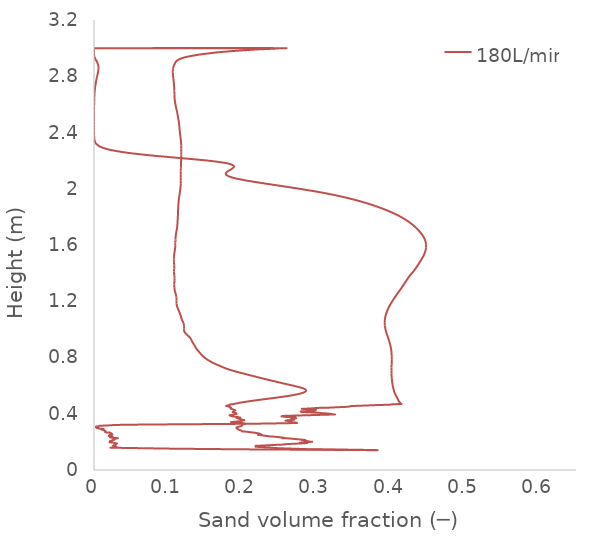
| Category | 180L/min |
|---|---|
| 0.369943 | 0.14 |
| 0.360485 | 0.144 |
| 0.335591 | 0.145 |
| 0.315067 | 0.146 |
| 0.293034 | 0.148 |
| 0.288265 | 0.148 |
| 0.275559 | 0.15 |
| 0.247444 | 0.155 |
| 0.235409 | 0.16 |
| 0.229629 | 0.161 |
| 0.226897 | 0.163 |
| 0.218637 | 0.165 |
| 0.218549 | 0.165 |
| 0.219073 | 0.171 |
| 0.218907 | 0.172 |
| 0.235123 | 0.176 |
| 0.248358 | 0.179 |
| 0.255184 | 0.181 |
| 0.255772 | 0.181 |
| 0.25628 | 0.181 |
| 0.25686 | 0.182 |
| 0.257129 | 0.182 |
| 0.256682 | 0.183 |
| 0.262632 | 0.185 |
| 0.287318 | 0.192 |
| 0.277536 | 0.194 |
| 0.293397 | 0.2 |
| 0.292918 | 0.201 |
| 0.291872 | 0.201 |
| 0.292191 | 0.201 |
| 0.291515 | 0.202 |
| 0.290686 | 0.202 |
| 0.281005 | 0.213 |
| 0.280462 | 0.213 |
| 0.28184 | 0.214 |
| 0.283546 | 0.214 |
| 0.283195 | 0.215 |
| 0.263237 | 0.224 |
| 0.262009 | 0.225 |
| 0.259293 | 0.225 |
| 0.25496 | 0.226 |
| 0.253109 | 0.227 |
| 0.254855 | 0.229 |
| 0.25538 | 0.23 |
| 0.243188 | 0.237 |
| 0.237106 | 0.239 |
| 0.233045 | 0.242 |
| 0.222062 | 0.249 |
| 0.222417 | 0.25 |
| 0.223795 | 0.25 |
| 0.225544 | 0.251 |
| 0.225555 | 0.251 |
| 0.226014 | 0.252 |
| 0.22598 | 0.252 |
| 0.225965 | 0.252 |
| 0.223069 | 0.259 |
| 0.222853 | 0.259 |
| 0.217275 | 0.265 |
| 0.216869 | 0.265 |
| 0.215009 | 0.266 |
| 0.214463 | 0.266 |
| 0.2044 | 0.273 |
| 0.199862 | 0.274 |
| 0.199863 | 0.274 |
| 0.199868 | 0.275 |
| 0.199716 | 0.275 |
| 0.199702 | 0.275 |
| 0.198971 | 0.279 |
| 0.196893 | 0.284 |
| 0.196449 | 0.285 |
| 0.195909 | 0.286 |
| 0.195221 | 0.286 |
| 0.193393 | 0.293 |
| 0.192344 | 0.296 |
| 0.192377 | 0.296 |
| 0.19254 | 0.296 |
| 0.193217 | 0.297 |
| 0.1929 | 0.298 |
| 0.192809 | 0.298 |
| 0.192113 | 0.302 |
| 0.195066 | 0.307 |
| 0.195598 | 0.308 |
| 0.195605 | 0.308 |
| 0.195454 | 0.308 |
| 0.195959 | 0.309 |
| 0.197189 | 0.311 |
| 0.197449 | 0.311 |
| 0.199062 | 0.312 |
| 0.19936 | 0.321 |
| 0.200365 | 0.322 |
| 0.199881 | 0.323 |
| 0.204016 | 0.329 |
| 0.203544 | 0.33 |
| 0.201994 | 0.331 |
| 0.200722 | 0.332 |
| 0.200748 | 0.333 |
| 0.20029 | 0.333 |
| 0.200152 | 0.333 |
| 0.185555 | 0.341 |
| 0.186625 | 0.342 |
| 0.189461 | 0.343 |
| 0.192214 | 0.345 |
| 0.19846 | 0.348 |
| 0.198485 | 0.348 |
| 0.1986 | 0.348 |
| 0.19858 | 0.348 |
| 0.198893 | 0.35 |
| 0.199864 | 0.351 |
| 0.202407 | 0.355 |
| 0.202526 | 0.355 |
| 0.198691 | 0.359 |
| 0.198931 | 0.36 |
| 0.198905 | 0.36 |
| 0.198395 | 0.361 |
| 0.19726 | 0.362 |
| 0.196656 | 0.363 |
| 0.192236 | 0.37 |
| 0.194893 | 0.371 |
| 0.197347 | 0.372 |
| 0.195531 | 0.374 |
| 0.191929 | 0.379 |
| 0.190294 | 0.38 |
| 0.186749 | 0.381 |
| 0.183183 | 0.388 |
| 0.183202 | 0.388 |
| 0.18341 | 0.389 |
| 0.182917 | 0.389 |
| 0.182885 | 0.39 |
| 0.18535 | 0.392 |
| 0.187263 | 0.394 |
| 0.190474 | 0.398 |
| 0.192926 | 0.401 |
| 0.19293 | 0.401 |
| 0.192932 | 0.401 |
| 0.189045 | 0.411 |
| 0.18756 | 0.412 |
| 0.187007 | 0.412 |
| 0.187464 | 0.413 |
| 0.187498 | 0.413 |
| 0.187376 | 0.413 |
| 0.188635 | 0.418 |
| 0.190007 | 0.423 |
| 0.190106 | 0.424 |
| 0.190341 | 0.424 |
| 0.190269 | 0.425 |
| 0.186362 | 0.433 |
| 0.184234 | 0.436 |
| 0.184411 | 0.437 |
| 0.184325 | 0.437 |
| 0.184878 | 0.442 |
| 0.183186 | 0.447 |
| 0.183152 | 0.447 |
| 0.183188 | 0.447 |
| 0.182915 | 0.448 |
| 0.18348 | 0.448 |
| 0.183518 | 0.448 |
| 0.183749 | 0.449 |
| 0.182955 | 0.45 |
| 0.178385 | 0.456 |
| 0.178975 | 0.457 |
| 0.17953 | 0.457 |
| 0.181478 | 0.46 |
| 0.183208 | 0.465 |
| 0.183247 | 0.465 |
| 0.188839 | 0.47 |
| 0.188895 | 0.47 |
| 0.188951 | 0.47 |
| 0.188983 | 0.47 |
| 0.199024 | 0.48 |
| 0.211677 | 0.491 |
| 0.226224 | 0.501 |
| 0.241479 | 0.511 |
| 0.255796 | 0.522 |
| 0.268079 | 0.532 |
| 0.27758 | 0.542 |
| 0.283484 | 0.553 |
| 0.285914 | 0.563 |
| 0.284951 | 0.574 |
| 0.280343 | 0.584 |
| 0.273049 | 0.594 |
| 0.264541 | 0.605 |
| 0.255999 | 0.615 |
| 0.247718 | 0.625 |
| 0.239459 | 0.636 |
| 0.231282 | 0.646 |
| 0.22345 | 0.656 |
| 0.215807 | 0.667 |
| 0.2082 | 0.677 |
| 0.200588 | 0.687 |
| 0.192975 | 0.698 |
| 0.185891 | 0.708 |
| 0.179804 | 0.718 |
| 0.17472 | 0.729 |
| 0.170161 | 0.739 |
| 0.165654 | 0.75 |
| 0.161338 | 0.76 |
| 0.157525 | 0.77 |
| 0.154178 | 0.781 |
| 0.151196 | 0.791 |
| 0.148585 | 0.801 |
| 0.146342 | 0.812 |
| 0.144484 | 0.822 |
| 0.142833 | 0.832 |
| 0.141183 | 0.843 |
| 0.139561 | 0.853 |
| 0.138013 | 0.863 |
| 0.136799 | 0.874 |
| 0.135725 | 0.884 |
| 0.134515 | 0.894 |
| 0.133296 | 0.905 |
| 0.132164 | 0.915 |
| 0.131304 | 0.926 |
| 0.130217 | 0.936 |
| 0.128489 | 0.946 |
| 0.126501 | 0.957 |
| 0.124489 | 0.967 |
| 0.122699 | 0.977 |
| 0.121632 | 0.988 |
| 0.121325 | 0.998 |
| 0.121343 | 1.008 |
| 0.121428 | 1.019 |
| 0.121423 | 1.029 |
| 0.121049 | 1.039 |
| 0.120216 | 1.05 |
| 0.119224 | 1.06 |
| 0.118415 | 1.07 |
| 0.11784 | 1.081 |
| 0.117285 | 1.091 |
| 0.116604 | 1.102 |
| 0.115903 | 1.112 |
| 0.115187 | 1.122 |
| 0.114387 | 1.133 |
| 0.113549 | 1.143 |
| 0.112738 | 1.153 |
| 0.112032 | 1.164 |
| 0.11154 | 1.174 |
| 0.111298 | 1.184 |
| 0.111234 | 1.195 |
| 0.111255 | 1.205 |
| 0.111286 | 1.215 |
| 0.111204 | 1.226 |
| 0.110913 | 1.236 |
| 0.110428 | 1.246 |
| 0.109852 | 1.257 |
| 0.109309 | 1.267 |
| 0.10888 | 1.278 |
| 0.108585 | 1.288 |
| 0.108397 | 1.298 |
| 0.108313 | 1.309 |
| 0.10832 | 1.319 |
| 0.108375 | 1.329 |
| 0.108449 | 1.34 |
| 0.108515 | 1.35 |
| 0.108549 | 1.36 |
| 0.108525 | 1.371 |
| 0.108409 | 1.381 |
| 0.108201 | 1.391 |
| 0.107992 | 1.402 |
| 0.107897 | 1.412 |
| 0.107958 | 1.422 |
| 0.108106 | 1.433 |
| 0.108206 | 1.443 |
| 0.108185 | 1.454 |
| 0.108063 | 1.464 |
| 0.107896 | 1.474 |
| 0.107753 | 1.485 |
| 0.107695 | 1.495 |
| 0.107735 | 1.505 |
| 0.107853 | 1.516 |
| 0.10802 | 1.526 |
| 0.108237 | 1.536 |
| 0.108513 | 1.547 |
| 0.108836 | 1.557 |
| 0.109163 | 1.567 |
| 0.109403 | 1.578 |
| 0.109534 | 1.588 |
| 0.109616 | 1.598 |
| 0.10967 | 1.609 |
| 0.109713 | 1.619 |
| 0.109772 | 1.63 |
| 0.109866 | 1.64 |
| 0.110001 | 1.65 |
| 0.110178 | 1.661 |
| 0.110399 | 1.671 |
| 0.110663 | 1.681 |
| 0.110986 | 1.692 |
| 0.111338 | 1.702 |
| 0.111721 | 1.713 |
| 0.112071 | 1.724 |
| 0.112311 | 1.736 |
| 0.112454 | 1.748 |
| 0.112623 | 1.759 |
| 0.112709 | 1.769 |
| 0.112818 | 1.779 |
| 0.11293 | 1.79 |
| 0.11304 | 1.8 |
| 0.113142 | 1.81 |
| 0.11322 | 1.821 |
| 0.113283 | 1.831 |
| 0.113349 | 1.842 |
| 0.113422 | 1.852 |
| 0.113507 | 1.862 |
| 0.113608 | 1.873 |
| 0.113726 | 1.883 |
| 0.113861 | 1.893 |
| 0.114021 | 1.904 |
| 0.114212 | 1.914 |
| 0.114432 | 1.924 |
| 0.11468 | 1.935 |
| 0.114957 | 1.945 |
| 0.115253 | 1.955 |
| 0.115556 | 1.966 |
| 0.115856 | 1.976 |
| 0.116141 | 1.986 |
| 0.116399 | 1.997 |
| 0.11662 | 2.007 |
| 0.116794 | 2.018 |
| 0.116923 | 2.028 |
| 0.117014 | 2.038 |
| 0.11707 | 2.049 |
| 0.117097 | 2.059 |
| 0.117109 | 2.069 |
| 0.11711 | 2.08 |
| 0.117105 | 2.09 |
| 0.117098 | 2.1 |
| 0.117098 | 2.111 |
| 0.117106 | 2.121 |
| 0.117123 | 2.131 |
| 0.117152 | 2.142 |
| 0.117194 | 2.152 |
| 0.117252 | 2.162 |
| 0.117321 | 2.173 |
| 0.117396 | 2.183 |
| 0.117475 | 2.194 |
| 0.117557 | 2.204 |
| 0.11764 | 2.214 |
| 0.117717 | 2.225 |
| 0.117779 | 2.235 |
| 0.117807 | 2.245 |
| 0.117806 | 2.256 |
| 0.117784 | 2.266 |
| 0.117755 | 2.276 |
| 0.117725 | 2.287 |
| 0.117686 | 2.297 |
| 0.117626 | 2.307 |
| 0.117539 | 2.318 |
| 0.117415 | 2.328 |
| 0.117245 | 2.338 |
| 0.117037 | 2.349 |
| 0.116806 | 2.359 |
| 0.116561 | 2.37 |
| 0.116312 | 2.38 |
| 0.11607 | 2.39 |
| 0.115847 | 2.401 |
| 0.115652 | 2.411 |
| 0.115479 | 2.421 |
| 0.115313 | 2.432 |
| 0.115139 | 2.442 |
| 0.114932 | 2.452 |
| 0.114687 | 2.463 |
| 0.114419 | 2.473 |
| 0.114139 | 2.483 |
| 0.113839 | 2.494 |
| 0.113513 | 2.504 |
| 0.113174 | 2.514 |
| 0.112825 | 2.525 |
| 0.112456 | 2.535 |
| 0.112053 | 2.546 |
| 0.11162 | 2.556 |
| 0.111175 | 2.566 |
| 0.11074 | 2.577 |
| 0.110325 | 2.587 |
| 0.109935 | 2.597 |
| 0.109575 | 2.608 |
| 0.109256 | 2.618 |
| 0.108986 | 2.628 |
| 0.108773 | 2.639 |
| 0.108618 | 2.649 |
| 0.108515 | 2.659 |
| 0.108454 | 2.67 |
| 0.108413 | 2.68 |
| 0.108372 | 2.69 |
| 0.108317 | 2.701 |
| 0.108242 | 2.711 |
| 0.108139 | 2.722 |
| 0.108003 | 2.732 |
| 0.10784 | 2.742 |
| 0.107658 | 2.753 |
| 0.107463 | 2.763 |
| 0.107256 | 2.773 |
| 0.107046 | 2.784 |
| 0.106841 | 2.794 |
| 0.106647 | 2.804 |
| 0.106481 | 2.815 |
| 0.106364 | 2.825 |
| 0.106328 | 2.835 |
| 0.106423 | 2.846 |
| 0.106694 | 2.856 |
| 0.107141 | 2.866 |
| 0.107802 | 2.877 |
| 0.108707 | 2.887 |
| 0.10976 | 2.898 |
| 0.111243 | 2.908 |
| 0.113959 | 2.918 |
| 0.118597 | 2.929 |
| 0.125937 | 2.939 |
| 0.13655 | 2.949 |
| 0.149888 | 2.96 |
| 0.166549 | 2.97 |
| 0.166549 | 2.97 |
| 0.189147 | 2.98 |
| 0.217783 | 2.99 |
| 0.241577 | 3 |
| 0.0790493 | 3 |
| 0.0788648 | 3 |
| 0.0769035 | 3 |
| 0.0775053 | 3 |
| 0.083624 | 3 |
| 0.107268 | 3 |
| 0.114288 | 3 |
| 0.134591 | 3 |
| 0.162728 | 3 |
| 0.200343 | 3 |
| 0.241268 | 3 |
| 0.241577 | 3 |
| 0.0169212 | 3 |
| 0.00833217 | 3 |
| 0.00571923 | 3 |
| 0.0051038 | 3 |
| 0.005763 | 3 |
| 0.0 | 3 |
| 0.0 | 3 |
| 0.0 | 3 |
| 0.0 | 3 |
| 0.0 | 3 |
| 0.0 | 3 |
| 0.0 | 3 |
| 0.0 | 2.997 |
| 0.0 | 2.988 |
| 0.0 | 2.978 |
| 0.0 | 2.969 |
| 0.0 | 2.959 |
| 0.000108252 | 2.95 |
| 0.000506919 | 2.94 |
| 0.00122163 | 2.93 |
| 0.00216427 | 2.92 |
| 0.00318886 | 2.91 |
| 0.00415965 | 2.9 |
| 0.0049795 | 2.89 |
| 0.00559327 | 2.88 |
| 0.00598295 | 2.87 |
| 0.0061322 | 2.86 |
| 0.00602501 | 2.85 |
| 0.00545124 | 2.83 |
| 0.00469901 | 2.811 |
| 0.00387265 | 2.791 |
| 0.00307686 | 2.771 |
| 0.0023716 | 2.752 |
| 0.00178243 | 2.732 |
| 0.00131181 | 2.712 |
| 0.000948811 | 2.692 |
| 0.000676403 | 2.673 |
| 0.000476436 | 2.653 |
| 0.000332368 | 2.633 |
| 0.000230245 | 2.614 |
| 0.000158733 | 2.594 |
| 0.000109056 | 2.574 |
| 7.47663e-05 | 2.555 |
| 5.12504e-05 | 2.535 |
| 3.54304e-05 | 2.515 |
| 2.5477e-05 | 2.495 |
| 2.02768e-05 | 2.476 |
| 1.84518e-05 | 2.456 |
| 1.92757e-05 | 2.436 |
| 2.67939e-05 | 2.417 |
| 4.97769e-05 | 2.397 |
| 0.000118284 | 2.377 |
| 0.000350554 | 2.358 |
| 0.00109618 | 2.338 |
| 0.00322555 | 2.318 |
| 0.00852937 | 2.298 |
| 0.0199051 | 2.279 |
| 0.0406427 | 2.259 |
| 0.0721662 | 2.239 |
| 0.113212 | 2.22 |
| 0.153775 | 2.2 |
| 0.180482 | 2.18 |
| 0.188756 | 2.16 |
| 0.185491 | 2.14 |
| 0.179382 | 2.12 |
| 0.177904 | 2.101 |
| 0.18582 | 2.081 |
| 0.203 | 2.061 |
| 0.225841 | 2.041 |
| 0.25082 | 2.021 |
| 0.275511 | 2.001 |
| 0.298341 | 1.981 |
| 0.318581 | 1.961 |
| 0.3362 | 1.941 |
| 0.351525 | 1.922 |
| 0.364964 | 1.902 |
| 0.37687 | 1.882 |
| 0.387496 | 1.862 |
| 0.396997 | 1.842 |
| 0.405459 | 1.822 |
| 0.412929 | 1.802 |
| 0.419454 | 1.782 |
| 0.425104 | 1.763 |
| 0.429987 | 1.743 |
| 0.43423 | 1.723 |
| 0.437933 | 1.703 |
| 0.441123 | 1.683 |
| 0.443768 | 1.663 |
| 0.445804 | 1.643 |
| 0.447176 | 1.623 |
| 0.447856 | 1.603 |
| 0.447854 | 1.584 |
| 0.447214 | 1.564 |
| 0.446016 | 1.544 |
| 0.444362 | 1.524 |
| 0.44236 | 1.504 |
| 0.440109 | 1.484 |
| 0.437689 | 1.464 |
| 0.435164 | 1.444 |
| 0.432573 | 1.424 |
| 0.429506 | 1.405 |
| 0.426261 | 1.385 |
| 0.426261 | 1.385 |
| 0.423502 | 1.365 |
| 0.421017 | 1.345 |
| 0.418558 | 1.325 |
| 0.416024 | 1.305 |
| 0.413401 | 1.285 |
| 0.410723 | 1.265 |
| 0.408045 | 1.246 |
| 0.405426 | 1.226 |
| 0.402923 | 1.206 |
| 0.400583 | 1.186 |
| 0.398446 | 1.166 |
| 0.396555 | 1.146 |
| 0.39495 | 1.126 |
| 0.393665 | 1.106 |
| 0.392732 | 1.086 |
| 0.392178 | 1.067 |
| 0.392018 | 1.047 |
| 0.39225 | 1.027 |
| 0.392849 | 1.007 |
| 0.393762 | 0.987 |
| 0.394903 | 0.967 |
| 0.396163 | 0.947 |
| 0.39743 | 0.927 |
| 0.3986 | 0.907 |
| 0.399594 | 0.888 |
| 0.400376 | 0.868 |
| 0.400937 | 0.848 |
| 0.401294 | 0.828 |
| 0.401476 | 0.808 |
| 0.401519 | 0.788 |
| 0.401467 | 0.768 |
| 0.401365 | 0.748 |
| 0.401262 | 0.729 |
| 0.401197 | 0.709 |
| 0.40121 | 0.689 |
| 0.401331 | 0.669 |
| 0.401586 | 0.649 |
| 0.401991 | 0.629 |
| 0.402558 | 0.609 |
| 0.403285 | 0.589 |
| 0.404182 | 0.569 |
| 0.40537 | 0.55 |
| 0.407124 | 0.53 |
| 0.409247 | 0.51 |
| 0.410996 | 0.49 |
| 0.414066 | 0.47 |
| 0.414213 | 0.47 |
| 0.414706 | 0.47 |
| 0.411898 | 0.469 |
| 0.409283 | 0.469 |
| 0.409467 | 0.469 |
| 0.408769 | 0.468 |
| 0.403665 | 0.467 |
| 0.401974 | 0.467 |
| 0.401891 | 0.467 |
| 0.401657 | 0.467 |
| 0.4023 | 0.466 |
| 0.402302 | 0.466 |
| 0.400164 | 0.465 |
| 0.399699 | 0.465 |
| 0.395369 | 0.464 |
| 0.381745 | 0.462 |
| 0.377162 | 0.461 |
| 0.374454 | 0.46 |
| 0.374225 | 0.46 |
| 0.368741 | 0.459 |
| 0.366317 | 0.459 |
| 0.358858 | 0.457 |
| 0.356614 | 0.457 |
| 0.356439 | 0.457 |
| 0.355801 | 0.457 |
| 0.346915 | 0.455 |
| 0.344169 | 0.451 |
| 0.338534 | 0.449 |
| 0.337407 | 0.448 |
| 0.334387 | 0.448 |
| 0.323546 | 0.445 |
| 0.316299 | 0.443 |
| 0.308742 | 0.442 |
| 0.304689 | 0.442 |
| 0.299064 | 0.441 |
| 0.29934 | 0.44 |
| 0.298933 | 0.44 |
| 0.282799 | 0.435 |
| 0.281341 | 0.435 |
| 0.296113 | 0.43 |
| 0.298174 | 0.429 |
| 0.29847 | 0.429 |
| 0.29907 | 0.429 |
| 0.293288 | 0.428 |
| 0.293574 | 0.427 |
| 0.290175 | 0.427 |
| 0.292512 | 0.426 |
| 0.29844 | 0.423 |
| 0.279792 | 0.417 |
| 0.280751 | 0.416 |
| 0.280931 | 0.415 |
| 0.281007 | 0.414 |
| 0.280065 | 0.413 |
| 0.293366 | 0.41 |
| 0.295624 | 0.409 |
| 0.30346 | 0.406 |
| 0.305307 | 0.406 |
| 0.305596 | 0.405 |
| 0.30634 | 0.405 |
| 0.306361 | 0.405 |
| 0.306656 | 0.405 |
| 0.306774 | 0.405 |
| 0.307958 | 0.404 |
| 0.31568 | 0.401 |
| 0.322942 | 0.396 |
| 0.323576 | 0.395 |
| 0.322227 | 0.395 |
| 0.319842 | 0.394 |
| 0.258559 | 0.385 |
| 0.259379 | 0.385 |
| 0.260266 | 0.384 |
| 0.252947 | 0.382 |
| 0.255129 | 0.38 |
| 0.25877 | 0.377 |
| 0.270369 | 0.374 |
| 0.271305 | 0.373 |
| 0.26589 | 0.371 |
| 0.272515 | 0.369 |
| 0.266974 | 0.366 |
| 0.266569 | 0.365 |
| 0.2668 | 0.364 |
| 0.266983 | 0.363 |
| 0.268672 | 0.358 |
| 0.269972 | 0.357 |
| 0.264102 | 0.355 |
| 0.260197 | 0.353 |
| 0.258905 | 0.351 |
| 0.258447 | 0.351 |
| 0.262222 | 0.348 |
| 0.263138 | 0.347 |
| 0.264754 | 0.346 |
| 0.266249 | 0.343 |
| 0.266459 | 0.342 |
| 0.265447 | 0.342 |
| 0.266957 | 0.341 |
| 0.267175 | 0.34 |
| 0.267175 | 0.34 |
| 0.270221 | 0.338 |
| 0.27285 | 0.337 |
| 0.273529 | 0.337 |
| 0.272508 | 0.335 |
| 0.273483 | 0.334 |
| 0.272455 | 0.334 |
| 0.258257 | 0.333 |
| 0.221207 | 0.329 |
| 0.213913 | 0.329 |
| 0.174734 | 0.327 |
| 0.120462 | 0.325 |
| 0.102903 | 0.325 |
| 0.0657229 | 0.323 |
| 0.0496027 | 0.322 |
| 0.0418026 | 0.321 |
| 0.0278338 | 0.32 |
| 0.0232788 | 0.318 |
| 0.0174886 | 0.316 |
| 0.0116751 | 0.315 |
| 0.00762702 | 0.315 |
| 0.00724868 | 0.314 |
| 0.00690186 | 0.313 |
| 0.00592551 | 0.311 |
| 0.00277737 | 0.309 |
| 0.00281701 | 0.307 |
| 0.00260301 | 0.305 |
| 0.00258638 | 0.304 |
| 0.0032368 | 0.302 |
| 0.0032778 | 0.301 |
| 0.00328145 | 0.301 |
| 0.00411199 | 0.298 |
| 0.00553609 | 0.297 |
| 0.00678199 | 0.296 |
| 0.00714692 | 0.294 |
| 0.0126978 | 0.291 |
| 0.0127978 | 0.291 |
| 0.0128038 | 0.291 |
| 0.010455 | 0.29 |
| 0.0101613 | 0.29 |
| 0.0102396 | 0.287 |
| 0.010254 | 0.287 |
| 0.0115206 | 0.286 |
| 0.0131377 | 0.284 |
| 0.0134083 | 0.282 |
| 0.0135214 | 0.282 |
| 0.0142313 | 0.28 |
| 0.0154486 | 0.278 |
| 0.0153716 | 0.278 |
| 0.0147175 | 0.274 |
| 0.015087 | 0.274 |
| 0.0154686 | 0.272 |
| 0.0151559 | 0.271 |
| 0.0152513 | 0.27 |
| 0.0156863 | 0.268 |
| 0.0217785 | 0.266 |
| 0.0224792 | 0.262 |
| 0.0227024 | 0.261 |
| 0.0230581 | 0.261 |
| 0.0230453 | 0.261 |
| 0.0228795 | 0.26 |
| 0.0232337 | 0.259 |
| 0.0237248 | 0.258 |
| 0.0242436 | 0.256 |
| 0.0247036 | 0.254 |
| 0.0218262 | 0.252 |
| 0.0212263 | 0.251 |
| 0.0207265 | 0.251 |
| 0.0210238 | 0.247 |
| 0.0206755 | 0.246 |
| 0.0204996 | 0.245 |
| 0.019948 | 0.242 |
| 0.0221757 | 0.24 |
| 0.0246695 | 0.239 |
| 0.0243472 | 0.237 |
| 0.0249581 | 0.235 |
| 0.0254939 | 0.234 |
| 0.0227767 | 0.233 |
| 0.0218703 | 0.233 |
| 0.0219152 | 0.232 |
| 0.0262932 | 0.228 |
| 0.0277129 | 0.227 |
| 0.0322232 | 0.226 |
| 0.0296091 | 0.224 |
| 0.0292105 | 0.223 |
| 0.0282677 | 0.221 |
| 0.0266038 | 0.22 |
| 0.0274013 | 0.216 |
| 0.0273501 | 0.216 |
| 0.0269791 | 0.215 |
| 0.0264467 | 0.214 |
| 0.0259098 | 0.213 |
| 0.024589 | 0.211 |
| 0.0234623 | 0.209 |
| 0.0232156 | 0.208 |
| 0.0227705 | 0.207 |
| 0.0218868 | 0.206 |
| 0.0216163 | 0.206 |
| 0.0239044 | 0.202 |
| 0.0226386 | 0.201 |
| 0.0208624 | 0.198 |
| 0.0214076 | 0.198 |
| 0.0233783 | 0.195 |
| 0.0257604 | 0.195 |
| 0.0291223 | 0.19 |
| 0.0293109 | 0.19 |
| 0.0306769 | 0.189 |
| 0.0310448 | 0.189 |
| 0.0306015 | 0.189 |
| 0.029796 | 0.188 |
| 0.0304896 | 0.188 |
| 0.0291689 | 0.183 |
| 0.0293173 | 0.181 |
| 0.0293532 | 0.18 |
| 0.0272754 | 0.178 |
| 0.0272754 | 0.178 |
| 0.0287236 | 0.177 |
| 0.0281917 | 0.177 |
| 0.0282047 | 0.174 |
| 0.0253494 | 0.171 |
| 0.0252585 | 0.171 |
| 0.0271051 | 0.168 |
| 0.0271739 | 0.168 |
| 0.027891 | 0.166 |
| 0.0273813 | 0.165 |
| 0.0300035 | 0.165 |
| 0.0300213 | 0.165 |
| 0.0301463 | 0.163 |
| 0.0240625 | 0.159 |
| 0.0261285 | 0.158 |
| 0.027565 | 0.158 |
| 0.0949235 | 0.153 |
| 0.102092 | 0.152 |
| 0.109 | 0.152 |
| 0.113214 | 0.151 |
| 0.201164 | 0.147 |
| 0.245598 | 0.145 |
| 0.247176 | 0.145 |
| 0.324566 | 0.143 |
| 0.380663 | 0.142 |
| 0.369943 | 0.14 |